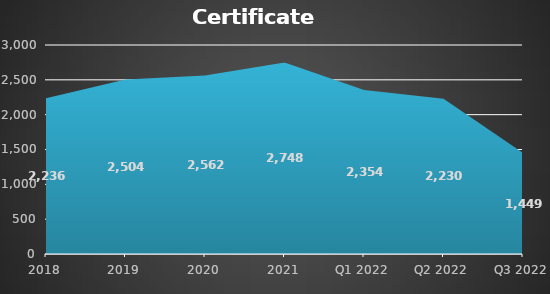
| Category | Certificate holders |
|---|---|
| 2018 | 2236 |
| 2019 | 2504 |
| 2020 | 2562 |
| 2021 | 2748 |
| Q1 2022 | 2354 |
| Q2 2022 | 2230 |
| Q3 2022 | 1449 |